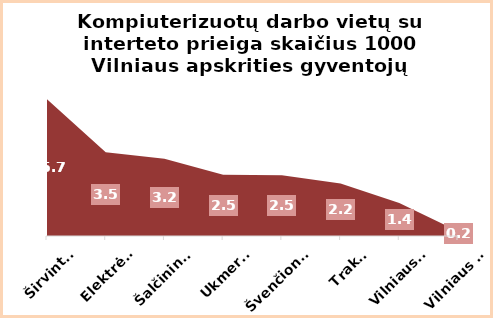
| Category | Series 0 |
|---|---|
| Širvintos | 5.663 |
| Elektrėnai | 3.466 |
| Šalčininkai | 3.195 |
| Ukmergė | 2.53 |
| Švenčionys | 2.513 |
| Trakai | 2.175 |
| Vilniaus r. | 1.368 |
| Vilniaus m. | 0.2 |